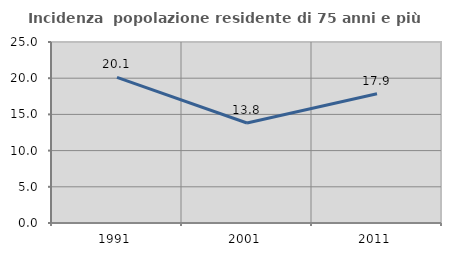
| Category | Incidenza  popolazione residente di 75 anni e più |
|---|---|
| 1991.0 | 20.113 |
| 2001.0 | 13.812 |
| 2011.0 | 17.857 |